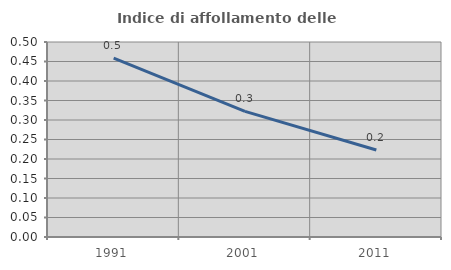
| Category | Indice di affollamento delle abitazioni  |
|---|---|
| 1991.0 | 0.459 |
| 2001.0 | 0.322 |
| 2011.0 | 0.223 |